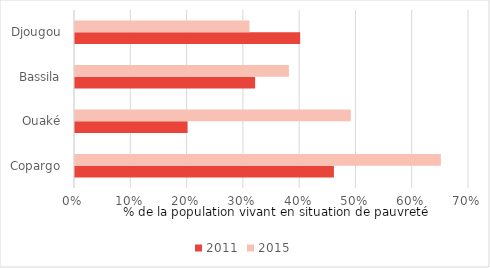
| Category | 2011 | 2015 |
|---|---|---|
| Copargo | 0.46 | 0.65 |
| Ouaké | 0.2 | 0.49 |
| Bassila | 0.32 | 0.38 |
| Djougou | 0.4 | 0.31 |